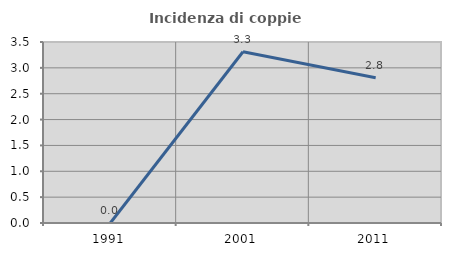
| Category | Incidenza di coppie miste |
|---|---|
| 1991.0 | 0 |
| 2001.0 | 3.311 |
| 2011.0 | 2.809 |